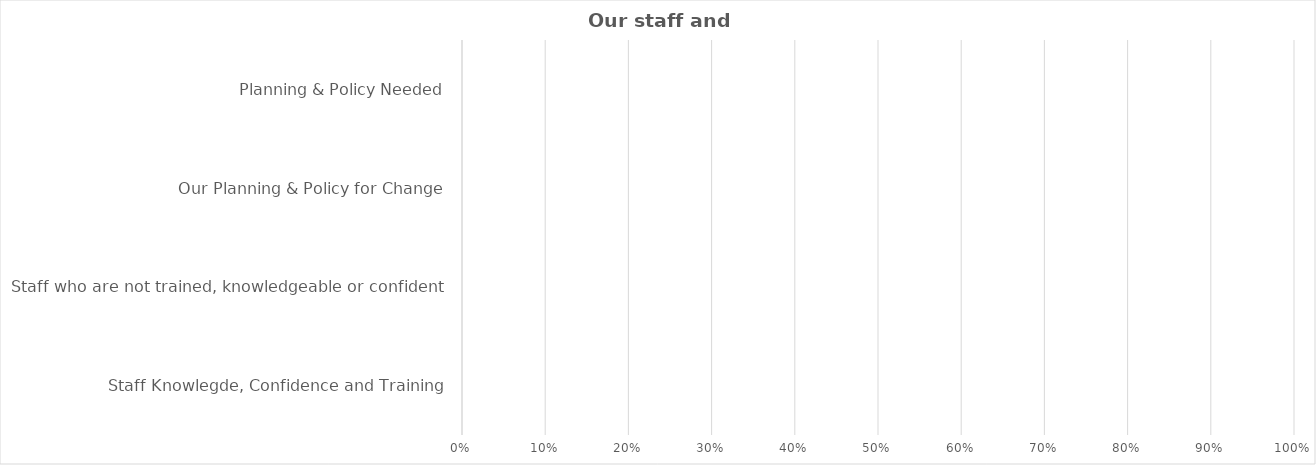
| Category | Series 0 |
|---|---|
| Staff Knowlegde, Confidence and Training | 0 |
| Staff who are not trained, knowledgeable or confident | 0 |
| Our Planning & Policy for Change | 0 |
| Planning & Policy Needed | 0 |